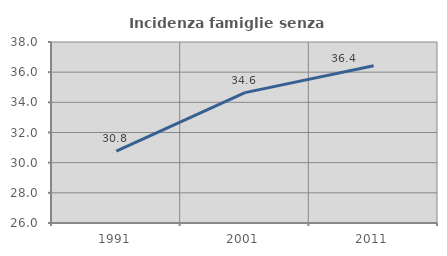
| Category | Incidenza famiglie senza nuclei |
|---|---|
| 1991.0 | 30.769 |
| 2001.0 | 34.644 |
| 2011.0 | 36.425 |